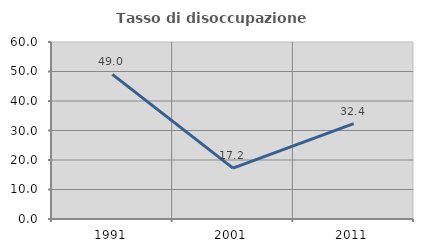
| Category | Tasso di disoccupazione giovanile  |
|---|---|
| 1991.0 | 49.038 |
| 2001.0 | 17.241 |
| 2011.0 | 32.353 |